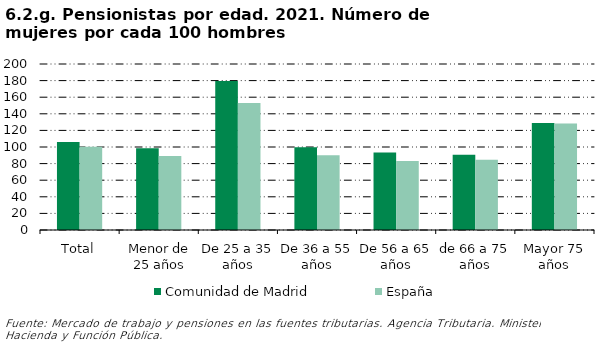
| Category | Comunidad de Madrid | España |
|---|---|---|
| Total | 106.146 | 100.434 |
| Menor de 25 años | 98.481 | 89.256 |
| De 25 a 35 años | 179.523 | 152.969 |
| De 36 a 55 años | 99.651 | 90.163 |
| De 56 a 65 años | 93.286 | 83.143 |
| de 66 a 75 años | 90.531 | 84.695 |
| Mayor 75 años | 129.057 | 128.242 |